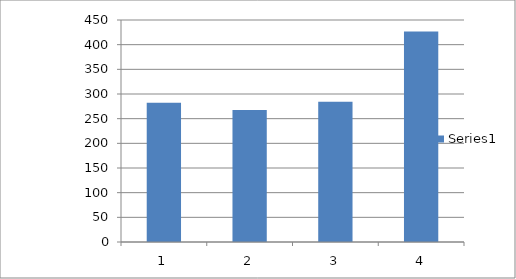
| Category | Series 0 |
|---|---|
| 0 | 282.481 |
| 1 | 267.434 |
| 2 | 284.298 |
| 3 | 426.741 |